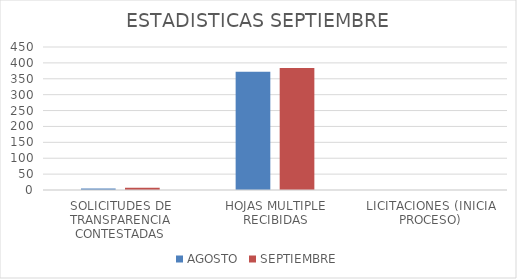
| Category | AGOSTO | SEPTIEMBRE |
|---|---|---|
| SOLICITUDES DE TRANSPARENCIA CONTESTADAS | 5 | 7 |
| HOJAS MULTIPLE RECIBIDAS | 372 | 384 |
| LICITACIONES (INICIA PROCESO) | 0 | 0 |